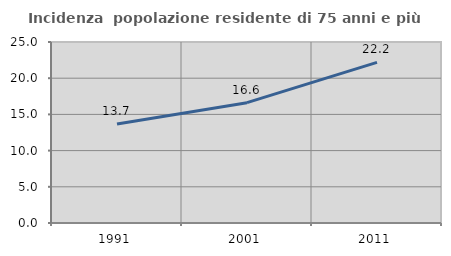
| Category | Incidenza  popolazione residente di 75 anni e più |
|---|---|
| 1991.0 | 13.667 |
| 2001.0 | 16.62 |
| 2011.0 | 22.184 |